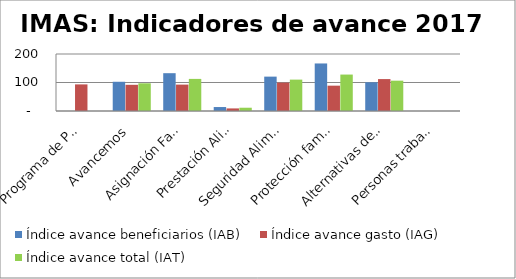
| Category | Índice avance beneficiarios (IAB)  | Índice avance gasto (IAG) | Índice avance total (IAT)  |
|---|---|---|---|
| Programa de Promoción y Protección Social | 0 | 93.333 | 0 |
| Avancemos | 102.542 | 91.892 | 97.217 |
| Asignación Familiar | 132.686 | 92.578 | 112.632 |
| Prestación Alimentaria | 13.908 | 9.07 | 11.489 |
| Seguridad Alimentaria | 120.61 | 99.625 | 110.117 |
| Protección familiar | 166.806 | 88.883 | 127.845 |
| Alternativas de Cuido | 100.805 | 111.981 | 106.393 |
| Personas trabajadores menores de edad | 0 | 0 | 0 |